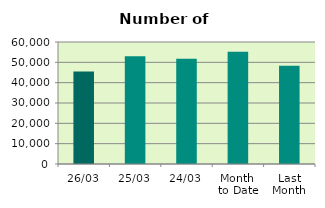
| Category | Series 0 |
|---|---|
| 26/03 | 45434 |
| 25/03 | 53002 |
| 24/03 | 51820 |
| Month 
to Date | 55186.3 |
| Last
Month | 48363.3 |